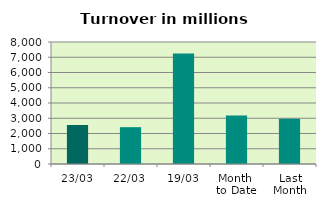
| Category | Series 0 |
|---|---|
| 23/03 | 2555.778 |
| 22/03 | 2414.353 |
| 19/03 | 7246.31 |
| Month 
to Date | 3176.339 |
| Last
Month | 2972.107 |